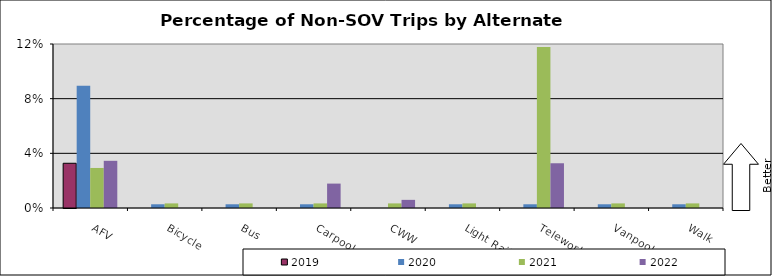
| Category | 2019 | 2020 | 2021 | 2022 |
|---|---|---|---|---|
| AFV | 0.033 | 0.089 | 0.029 | 0.035 |
| Bicycle | 0 | 0.003 | 0.003 | 0 |
| Bus | 0 | 0.003 | 0.003 | 0 |
| Carpool | 0 | 0.003 | 0.003 | 0.018 |
| CWW | 0 | 0 | 0.003 | 0.006 |
| Light Rail | 0 | 0.003 | 0.003 | 0 |
| Telework | 0 | 0.003 | 0.118 | 0.033 |
| Vanpool | 0 | 0.003 | 0.003 | 0 |
| Walk | 0 | 0.003 | 0.003 | 0 |